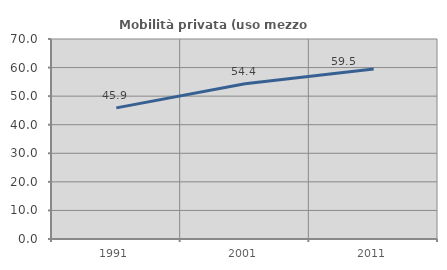
| Category | Mobilità privata (uso mezzo privato) |
|---|---|
| 1991.0 | 45.902 |
| 2001.0 | 54.369 |
| 2011.0 | 59.516 |